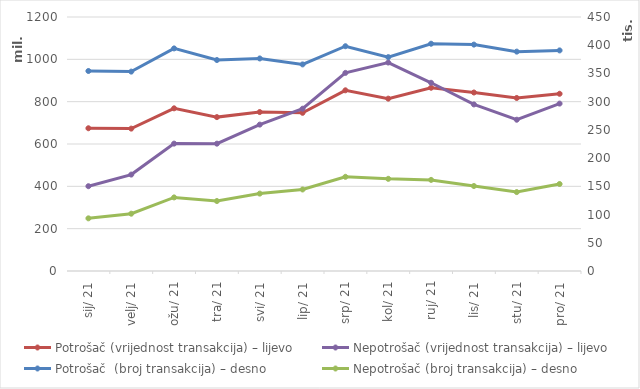
| Category | Potrošač (vrijednost transakcija) – lijevo | Nepotrošač (vrijednost transakcija) – lijevo |
|---|---|---|
| 2021-01-01 | 674368182 | 400550056 |
| 2021-02-01 | 672671621 | 455515228 |
| 2021-03-01 | 768545976 | 601784252 |
| 2021-04-01 | 727038745 | 601591184 |
| 2021-05-01 | 750863121 | 691573949 |
| 2021-06-01 | 747334325 | 766756303 |
| 2021-07-01 | 853670534 | 935967873 |
| 2021-08-01 | 814239011 | 984915587 |
| 2021-09-01 | 865779631 | 889244147 |
| 2021-10-01 | 843317195 | 786974816 |
| 2021-11-01 | 817483434 | 714706160 |
| 2021-12-01 | 837271651 | 790888465 |